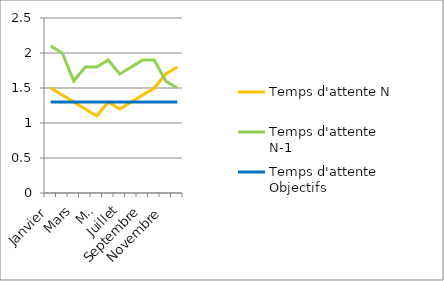
| Category | Temps d'attente N | Temps d'attente N-1 | Temps d'attente Objectifs |
|---|---|---|---|
| Janvier | 1.5 | 2.1 | 1.3 |
| Février | 1.4 | 2 | 1.3 |
| Mars | 1.3 | 1.6 | 1.3 |
| Avril | 1.2 | 1.8 | 1.3 |
| Mai | 1.1 | 1.8 | 1.3 |
| Juin | 1.3 | 1.9 | 1.3 |
| Juillet | 1.2 | 1.7 | 1.3 |
| Août | 1.3 | 1.8 | 1.3 |
| Septembre | 1.4 | 1.9 | 1.3 |
| Octobre | 1.5 | 1.9 | 1.3 |
| Novembre | 1.7 | 1.6 | 1.3 |
| Décembre | 1.8 | 1.5 | 1.3 |